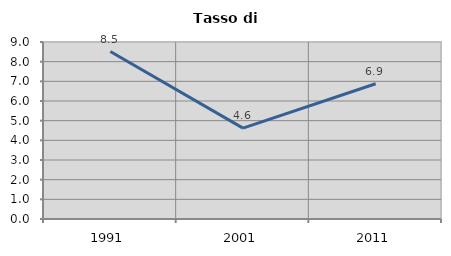
| Category | Tasso di disoccupazione   |
|---|---|
| 1991.0 | 8.514 |
| 2001.0 | 4.62 |
| 2011.0 | 6.878 |